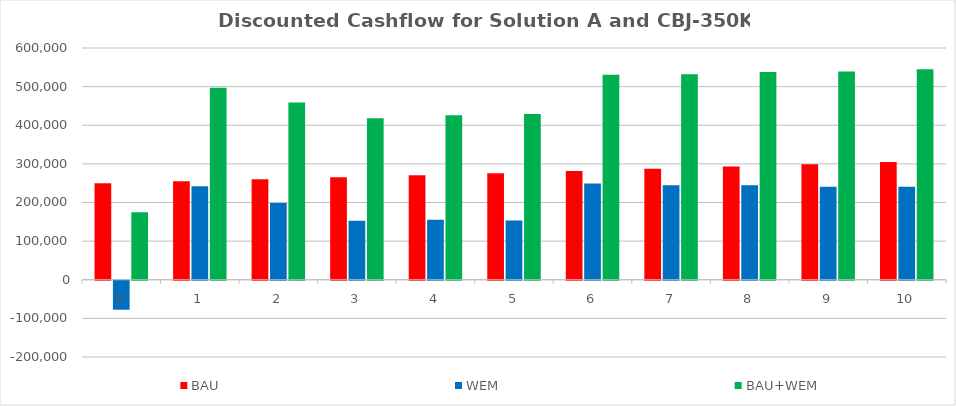
| Category | BAU | WEM | BAU+WEM |
|---|---|---|---|
| 0.0 | 250000 | -75000 | 175000 |
| 1.0 | 255000 | 242134 | 497134 |
| 2.0 | 260100 | 198479 | 458579 |
| 3.0 | 265302 | 152711 | 418013 |
| 4.0 | 270608 | 155164 | 425772 |
| 5.0 | 276020 | 153305 | 429325 |
| 6.0 | 281540 | 249000 | 530540 |
| 7.0 | 287171 | 244750 | 531921 |
| 8.0 | 292914 | 244750 | 537664 |
| 9.0 | 298772 | 240500 | 539272 |
| 10.0 | 304747 | 240500 | 545247 |